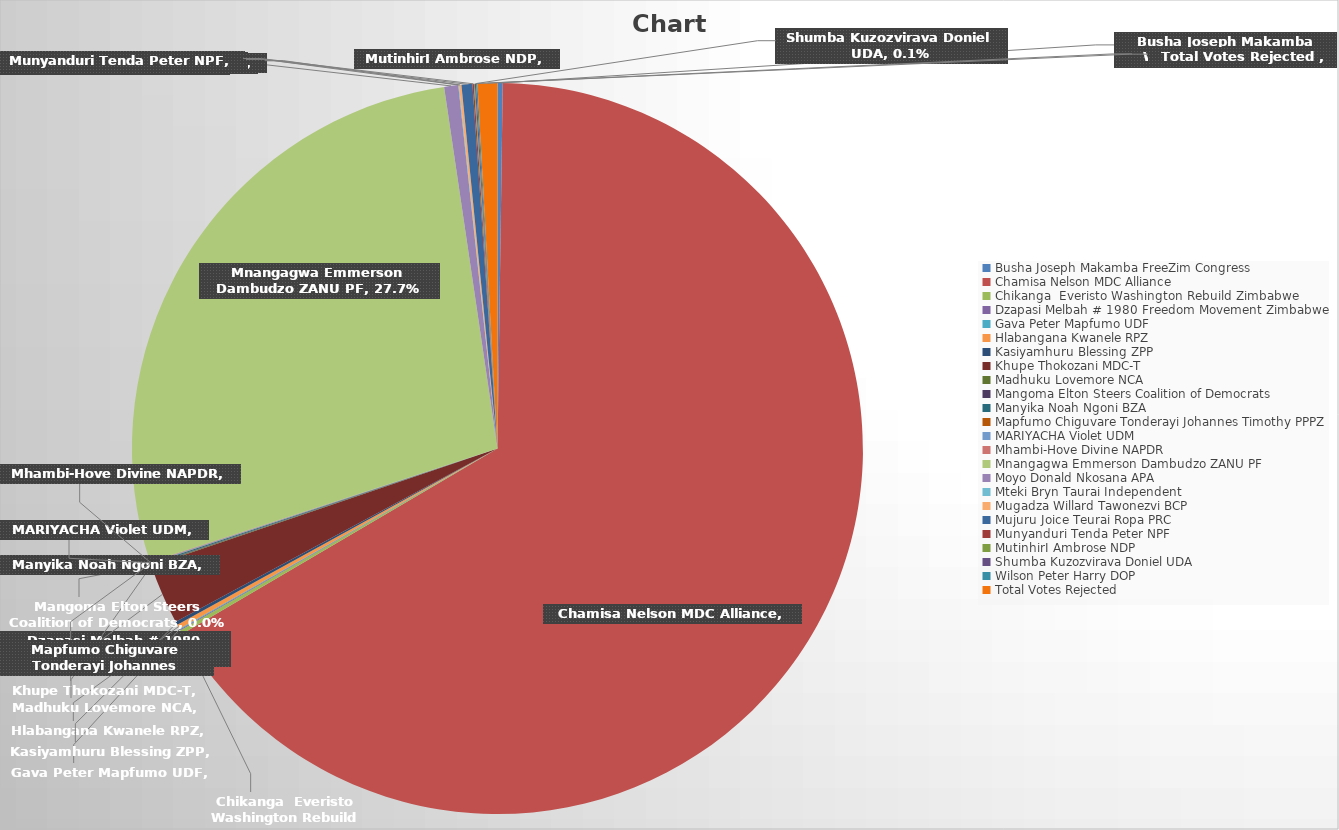
| Category | Series 0 |
|---|---|
| Busha Joseph Makamba FreeZim Congress | 0.002 |
| Chamisa Nelson MDC Alliance | 0.663 |
| Chikanga  Everisto Washington Rebuild Zimbabwe | 0.002 |
| Dzapasi Melbah # 1980 Freedom Movement Zimbabwe | 0 |
| Gava Peter Mapfumo UDF | 0 |
| Hlabangana Kwanele RPZ | 0.002 |
| Kasiyamhuru Blessing ZPP | 0.001 |
| Khupe Thokozani MDC-T | 0.026 |
| Madhuku Lovemore NCA | 0 |
| Mangoma Elton Steers Coalition of Democrats | 0 |
| Manyika Noah Ngoni BZA | 0 |
| Mapfumo Chiguvare Tonderayi Johannes Timothy PPPZ | 0 |
| MARIYACHA Violet UDM | 0 |
| Mhambi-Hove Divine NAPDR | 0 |
| Mnangagwa Emmerson Dambudzo ZANU PF | 0.277 |
| Moyo Donald Nkosana APA | 0.006 |
| Mteki Bryn Taurai Independent | 0 |
| Mugadza Willard Tawonezvi BCP | 0.001 |
| Mujuru Joice Teurai Ropa PRC | 0.005 |
| Munyanduri Tenda Peter NPF | 0.001 |
| MutinhirI Ambrose NDP | 0 |
| Shumba Kuzozvirava Doniel UDA | 0.001 |
| Wilson Peter Harry DOP | 0.001 |
| Total Votes Rejected  | 0.009 |